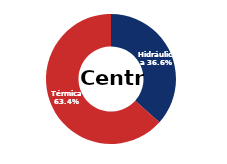
| Category | Centro |
|---|---|
| Eólica | 0 |
| Hidráulica | 1502.416 |
| Solar | 0.006 |
| Térmica | 2601.482 |